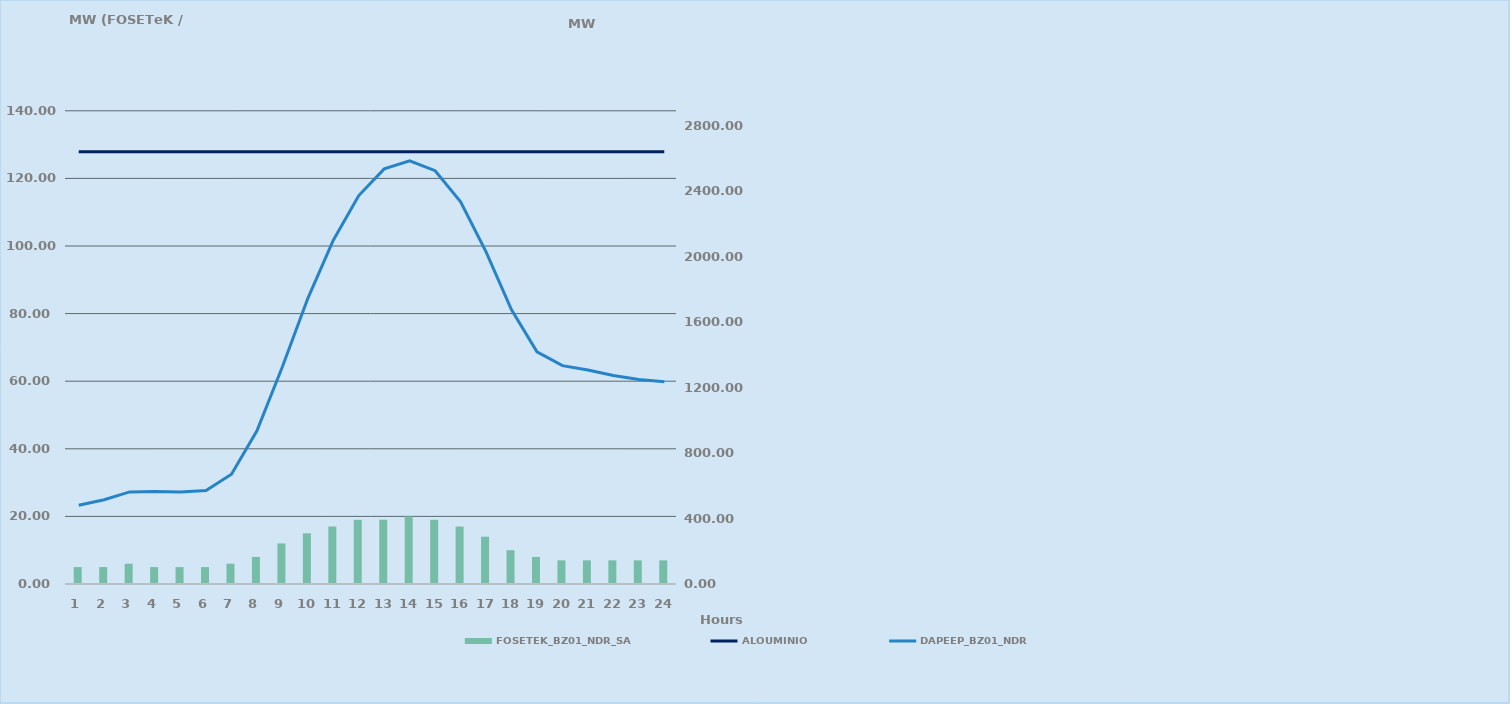
| Category | FOSETEK_BZ01_NDR_SA |
|---|---|
| 0 | 5 |
| 1 | 5 |
| 2 | 6 |
| 3 | 5 |
| 4 | 5 |
| 5 | 5 |
| 6 | 6 |
| 7 | 8 |
| 8 | 12 |
| 9 | 15 |
| 10 | 17 |
| 11 | 19 |
| 12 | 19 |
| 13 | 20 |
| 14 | 19 |
| 15 | 17 |
| 16 | 14 |
| 17 | 10 |
| 18 | 8 |
| 19 | 7 |
| 20 | 7 |
| 21 | 7 |
| 22 | 7 |
| 23 | 7 |